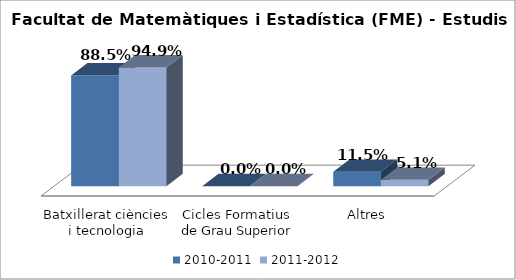
| Category | 2010-2011 | 2011-2012 |
|---|---|---|
| Batxillerat ciències i tecnologia | 0.885 | 0.949 |
| Cicles Formatius de Grau Superior | 0 | 0 |
| Altres | 0.115 | 0.051 |